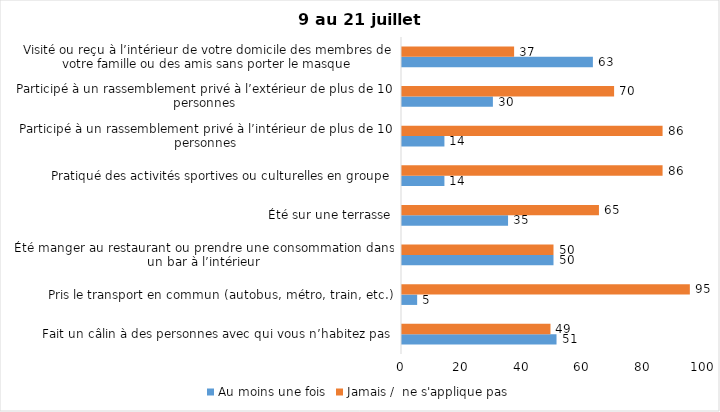
| Category | Au moins une fois | Jamais /  ne s'applique pas |
|---|---|---|
| Fait un câlin à des personnes avec qui vous n’habitez pas | 51 | 49 |
| Pris le transport en commun (autobus, métro, train, etc.) | 5 | 95 |
| Été manger au restaurant ou prendre une consommation dans un bar à l’intérieur | 50 | 50 |
| Été sur une terrasse | 35 | 65 |
| Pratiqué des activités sportives ou culturelles en groupe | 14 | 86 |
| Participé à un rassemblement privé à l’intérieur de plus de 10 personnes | 14 | 86 |
| Participé à un rassemblement privé à l’extérieur de plus de 10 personnes | 30 | 70 |
| Visité ou reçu à l’intérieur de votre domicile des membres de votre famille ou des amis sans porter le masque | 63 | 37 |